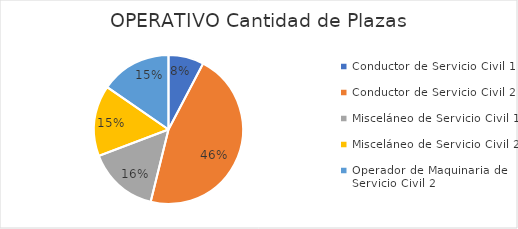
| Category | OPERATIVO |
|---|---|
| Conductor de Servicio Civil 1 | 1 |
| Conductor de Servicio Civil 2 | 6 |
| Misceláneo de Servicio Civil 1 | 2 |
| Misceláneo de Servicio Civil 2 | 2 |
| Operador de Maquinaria de Servicio Civil 2 | 2 |